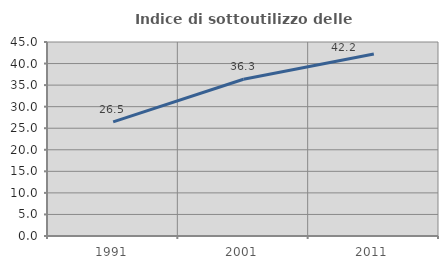
| Category | Indice di sottoutilizzo delle abitazioni  |
|---|---|
| 1991.0 | 26.48 |
| 2001.0 | 36.35 |
| 2011.0 | 42.21 |